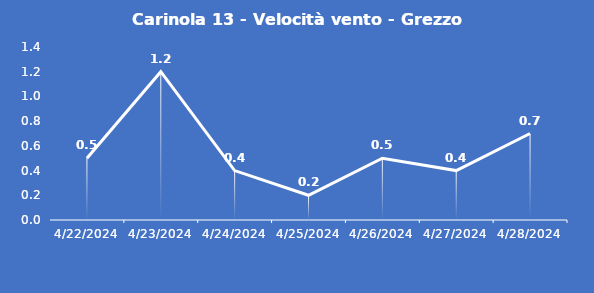
| Category | Carinola 13 - Velocità vento - Grezzo (m/s) |
|---|---|
| 4/22/24 | 0.5 |
| 4/23/24 | 1.2 |
| 4/24/24 | 0.4 |
| 4/25/24 | 0.2 |
| 4/26/24 | 0.5 |
| 4/27/24 | 0.4 |
| 4/28/24 | 0.7 |